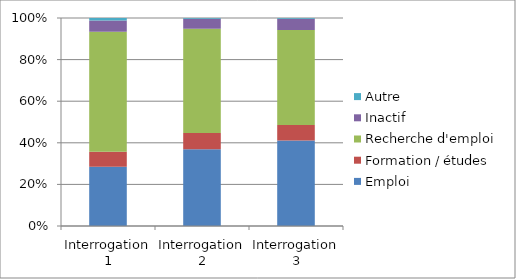
| Category | Emploi | Formation / études | Recherche d'emploi | Inactif | Autre |
|---|---|---|---|---|---|
| Interrogation 1 | 28.52 | 7.13 | 57.71 | 5.49 | 1.16 |
| Interrogation 2 | 36.91 | 7.78 | 50.13 | 4.84 | 0.35 |
| Interrogation 3 | 41.11 | 7.44 | 45.64 | 5.42 | 0.41 |